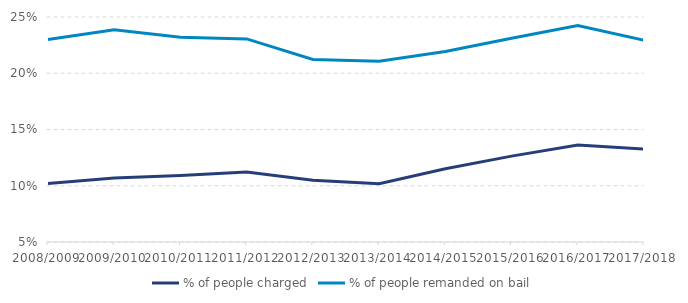
| Category | % of people charged | % of people remanded on bail |
|---|---|---|
| 2008/2009 | 0.102 | 0.23 |
| 2009/2010 | 0.107 | 0.239 |
| 2010/2011 | 0.109 | 0.232 |
| 2011/2012 | 0.112 | 0.231 |
| 2012/2013 | 0.105 | 0.212 |
| 2013/2014 | 0.102 | 0.211 |
| 2014/2015 | 0.115 | 0.219 |
| 2015/2016 | 0.126 | 0.231 |
| 2016/2017 | 0.136 | 0.242 |
| 2017/2018 | 0.133 | 0.229 |